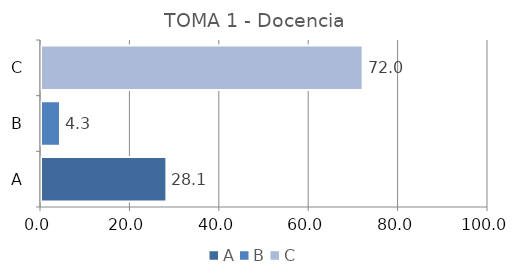
| Category | Series 0 |
|---|---|
| A | 28.05 |
| B | 4.25 |
| C | 71.95 |